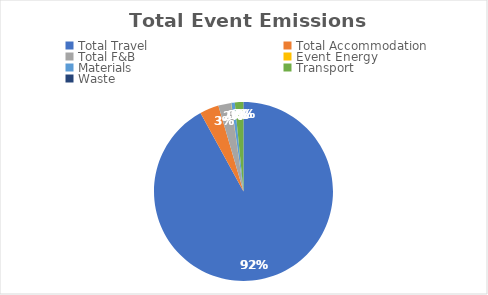
| Category | Series 0 |
|---|---|
| Total Travel | 99.1 |
| Total Accommodation | 3.71 |
| Total F&B | 2.48 |
| Event Energy | 0.06 |
| Materials | 0.67 |
| Transport | 1.65 |
| Waste | 0.02 |